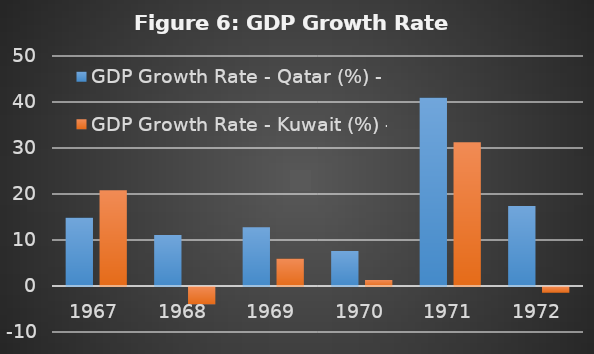
| Category | GDP Growth Rate - Qatar (%) | GDP Growth Rate - Kuwait (%) |
|---|---|---|
| 1967.0 | 14.858 | 20.821 |
| 1968.0 | 11.088 | -3.762 |
| 1969.0 | 12.754 | 5.927 |
| 1970.0 | 7.623 | 1.31 |
| 1971.0 | 40.899 | 31.257 |
| 1972.0 | 17.405 | -1.253 |